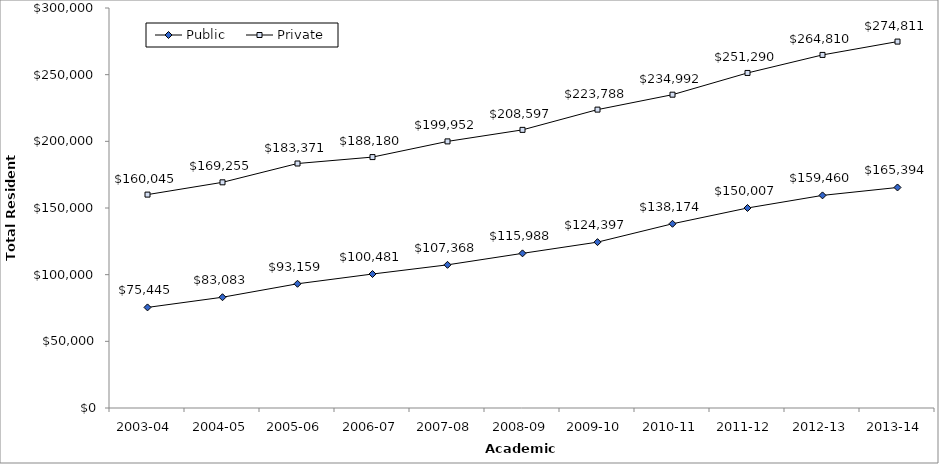
| Category | Public | Private |
|---|---|---|
| 2003-04 | 75445 | 160045 |
| 2004-05 | 83083 | 169255 |
| 2005-06 | 93159 | 183371 |
| 2006-07 | 100481 | 188180 |
| 2007-08 | 107368 | 199952 |
| 2008-09 | 115988 | 208597 |
| 2009-10 | 124397 | 223788 |
| 2010-11 | 138174 | 234992 |
| 2011-12 | 150007 | 251290 |
| 2012-13 | 159460 | 264810 |
| 2013-14 | 165394 | 274811 |